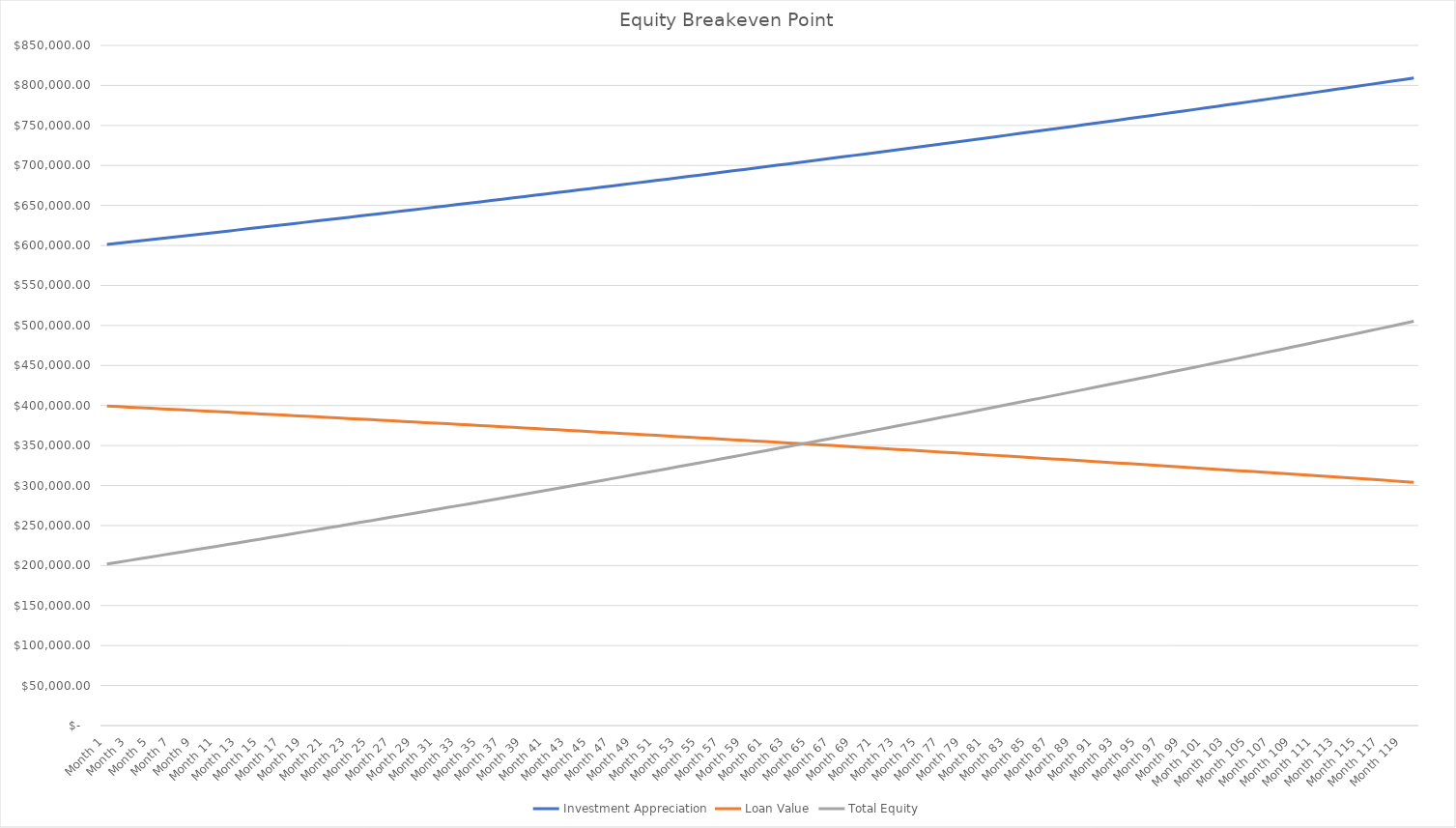
| Category | Investment Appreciation | Loan Value | Total Equity |
|---|---|---|---|
| Month 1 | 601250 | 399313.58 | 201936.42 |
| Month 2 | 602753.125 | 398625.44 | 204127.685 |
| Month 3 | 604260.008 | 397935.58 | 206324.428 |
| Month 4 | 605770.658 | 397244 | 208526.658 |
| Month 5 | 607285.084 | 396550.69 | 210734.394 |
| Month 6 | 608803.297 | 395855.65 | 212947.647 |
| Month 7 | 610325.305 | 395158.87 | 215166.435 |
| Month 8 | 611851.119 | 394460.35 | 217390.769 |
| Month 9 | 613380.746 | 393760.08 | 219620.666 |
| Month 10 | 614914.198 | 393058.06 | 221856.138 |
| Month 11 | 616451.484 | 392354.29 | 224097.194 |
| Month 12 | 617992.613 | 391648.76 | 226343.853 |
| Month 13 | 619537.594 | 390941.46 | 228596.134 |
| Month 14 | 621086.438 | 390232.39 | 230854.048 |
| Month 15 | 622639.154 | 389521.55 | 233117.604 |
| Month 16 | 624195.752 | 388808.93 | 235386.822 |
| Month 17 | 625756.241 | 388094.53 | 237661.711 |
| Month 18 | 627320.632 | 387378.35 | 239942.282 |
| Month 19 | 628888.934 | 386660.38 | 242228.554 |
| Month 20 | 630461.156 | 385940.61 | 244520.546 |
| Month 21 | 632037.309 | 385219.04 | 246818.269 |
| Month 22 | 633617.402 | 384495.67 | 249121.732 |
| Month 23 | 635201.446 | 383770.49 | 251430.956 |
| Month 24 | 636789.449 | 383043.5 | 253745.949 |
| Month 25 | 638381.423 | 382314.69 | 256066.733 |
| Month 26 | 639977.376 | 381584.06 | 258393.316 |
| Month 27 | 641577.32 | 380851.6 | 260725.72 |
| Month 28 | 643181.263 | 380117.31 | 263063.953 |
| Month 29 | 644789.216 | 379381.18 | 265408.036 |
| Month 30 | 646401.189 | 378643.21 | 267757.979 |
| Month 31 | 648017.192 | 377903.4 | 270113.792 |
| Month 32 | 649637.235 | 377161.74 | 272475.495 |
| Month 33 | 651261.328 | 376418.22 | 274843.108 |
| Month 34 | 652889.482 | 375672.85 | 277216.632 |
| Month 35 | 654521.705 | 374925.61 | 279596.095 |
| Month 36 | 656158.01 | 374176.5 | 281981.51 |
| Month 37 | 657798.405 | 373425.52 | 284372.885 |
| Month 38 | 659442.901 | 372672.66 | 286770.241 |
| Month 39 | 661091.508 | 371917.92 | 289173.588 |
| Month 40 | 662744.237 | 371161.29 | 291582.947 |
| Month 41 | 664401.097 | 370402.77 | 293998.327 |
| Month 42 | 666062.1 | 369642.36 | 296419.74 |
| Month 43 | 667727.255 | 368880.05 | 298847.205 |
| Month 44 | 669396.573 | 368115.83 | 301280.743 |
| Month 45 | 671070.065 | 367349.7 | 303720.365 |
| Month 46 | 672747.74 | 366581.65 | 306166.09 |
| Month 47 | 674429.609 | 365811.68 | 308617.929 |
| Month 48 | 676115.683 | 365039.79 | 311075.893 |
| Month 49 | 677805.973 | 364265.97 | 313540.003 |
| Month 50 | 679500.488 | 363490.21 | 316010.278 |
| Month 51 | 681199.239 | 362712.52 | 318486.719 |
| Month 52 | 682902.237 | 361932.88 | 320969.357 |
| Month 53 | 684609.492 | 361151.29 | 323458.202 |
| Month 54 | 686321.016 | 360367.75 | 325953.266 |
| Month 55 | 688036.819 | 359582.25 | 328454.569 |
| Month 56 | 689756.911 | 358794.79 | 330962.121 |
| Month 57 | 691481.303 | 358005.36 | 333475.943 |
| Month 58 | 693210.006 | 357213.95 | 335996.056 |
| Month 59 | 694943.031 | 356420.56 | 338522.471 |
| Month 60 | 696680.389 | 355625.19 | 341055.199 |
| Month 61 | 698422.09 | 354827.83 | 343594.26 |
| Month 62 | 700168.145 | 354028.48 | 346139.665 |
| Month 63 | 701918.565 | 353227.13 | 348691.435 |
| Month 64 | 703673.362 | 352423.78 | 351249.582 |
| Month 65 | 705432.545 | 351618.42 | 353814.125 |
| Month 66 | 707196.127 | 350811.05 | 356385.077 |
| Month 67 | 708964.117 | 350001.66 | 358962.457 |
| Month 68 | 710736.527 | 349190.24 | 361546.287 |
| Month 69 | 712513.369 | 348376.8 | 364136.569 |
| Month 70 | 714294.652 | 347561.32 | 366733.332 |
| Month 71 | 716080.389 | 346743.8 | 369336.589 |
| Month 72 | 717870.59 | 345924.24 | 371946.35 |
| Month 73 | 719665.266 | 345102.63 | 374562.636 |
| Month 74 | 721464.429 | 344278.97 | 377185.459 |
| Month 75 | 723268.09 | 343453.25 | 379814.84 |
| Month 76 | 725076.261 | 342625.46 | 382450.801 |
| Month 77 | 726888.951 | 341795.6 | 385093.351 |
| Month 78 | 728706.174 | 340963.67 | 387742.504 |
| Month 79 | 730527.939 | 340129.66 | 390398.279 |
| Month 80 | 732354.259 | 339293.56 | 393060.699 |
| Month 81 | 734185.145 | 338455.37 | 395729.775 |
| Month 82 | 736020.607 | 337615.09 | 398405.517 |
| Month 83 | 737860.659 | 336772.71 | 401087.949 |
| Month 84 | 739705.311 | 335928.22 | 403777.091 |
| Month 85 | 741554.574 | 335081.62 | 406472.954 |
| Month 86 | 743408.46 | 334232.9 | 409175.56 |
| Month 87 | 745266.981 | 333382.06 | 411884.921 |
| Month 88 | 747130.149 | 332529.1 | 414601.049 |
| Month 89 | 748997.974 | 331674 | 417323.974 |
| Month 90 | 750870.469 | 330816.77 | 420053.699 |
| Month 91 | 752747.645 | 329957.39 | 422790.255 |
| Month 92 | 754629.514 | 329095.86 | 425533.654 |
| Month 93 | 756516.088 | 328232.18 | 428283.908 |
| Month 94 | 758407.378 | 327366.34 | 431041.038 |
| Month 95 | 760303.397 | 326498.34 | 433805.057 |
| Month 96 | 762204.155 | 325628.17 | 436575.985 |
| Month 97 | 764109.666 | 324755.82 | 439353.846 |
| Month 98 | 766019.94 | 323881.29 | 442138.65 |
| Month 99 | 767934.99 | 323004.57 | 444930.42 |
| Month 100 | 769854.827 | 322125.66 | 447729.167 |
| Month 101 | 771779.464 | 321244.55 | 450534.914 |
| Month 102 | 773708.913 | 320361.24 | 453347.673 |
| Month 103 | 775643.185 | 319475.72 | 456167.465 |
| Month 104 | 777582.293 | 318587.99 | 458994.303 |
| Month 105 | 779526.249 | 317698.04 | 461828.209 |
| Month 106 | 781475.065 | 316805.87 | 464669.195 |
| Month 107 | 783428.752 | 315911.46 | 467517.292 |
| Month 108 | 785387.324 | 315014.82 | 470372.504 |
| Month 109 | 787350.792 | 314115.94 | 473234.852 |
| Month 110 | 789319.169 | 313214.81 | 476104.359 |
| Month 111 | 791292.467 | 312311.43 | 478981.037 |
| Month 112 | 793270.699 | 311405.79 | 481864.909 |
| Month 113 | 795253.875 | 310497.88 | 484755.995 |
| Month 114 | 797242.01 | 309587.7 | 487654.31 |
| Month 115 | 799235.115 | 308675.25 | 490559.865 |
| Month 116 | 801233.203 | 307760.52 | 493472.683 |
| Month 117 | 803236.286 | 306843.5 | 496392.786 |
| Month 118 | 805244.377 | 305924.19 | 499320.187 |
| Month 119 | 807257.487 | 305002.58 | 502254.907 |
| Month 120 | 809275.631 | 304078.67 | 505196.961 |